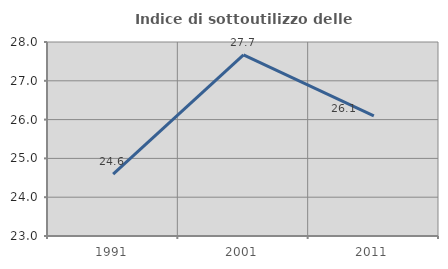
| Category | Indice di sottoutilizzo delle abitazioni  |
|---|---|
| 1991.0 | 24.594 |
| 2001.0 | 27.671 |
| 2011.0 | 26.096 |